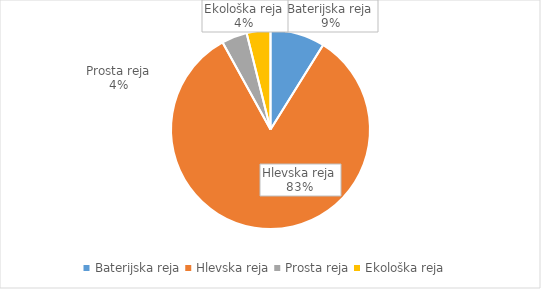
| Category | Količina kosov jajc |
|---|---|
| Baterijska reja | 246013 |
| Hlevska reja | 2308429 |
| Prosta reja | 115035 |
| Ekološka reja | 107320 |